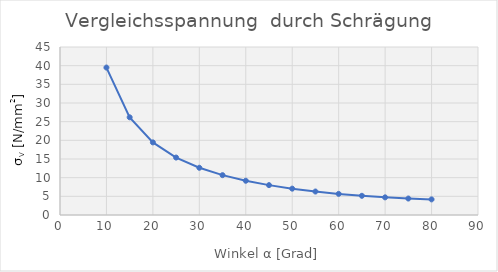
| Category | Series 0 |
|---|---|
| 10.0 | 39.495 |
| 15.0 | 26.164 |
| 20.0 | 19.451 |
| 25.0 | 15.387 |
| 30.0 | 12.649 |
| 35.0 | 10.672 |
| 40.0 | 9.175 |
| 45.0 | 8 |
| 50.0 | 7.057 |
| 55.0 | 6.288 |
| 60.0 | 5.657 |
| 65.0 | 5.142 |
| 70.0 | 4.729 |
| 75.0 | 4.41 |
| 80.0 | 4.182 |